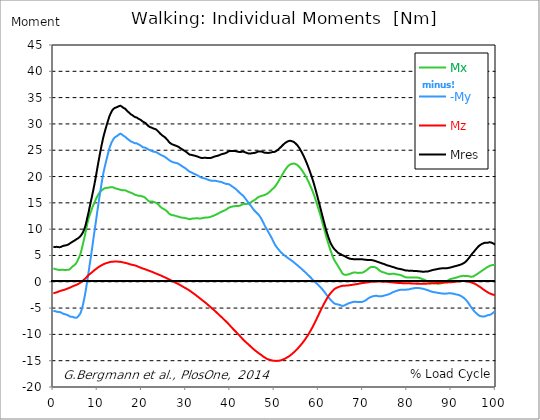
| Category |  Mx |  -My |  Mz |  Mres |
|---|---|---|---|---|
| 0.0 | 2.55 | -5.54 | -2.19 | 6.65 |
| 0.1647276845464841 | 2.49 | -5.52 | -2.15 | 6.59 |
| 0.3294553690929682 | 2.43 | -5.57 | -2.11 | 6.6 |
| 0.5044785339236075 | 2.4 | -5.63 | -2.07 | 6.62 |
| 0.6692062184700917 | 2.37 | -5.68 | -2.03 | 6.64 |
| 0.8339339030165757 | 2.33 | -5.7 | -1.98 | 6.63 |
| 0.9986615875630598 | 2.29 | -5.72 | -1.92 | 6.61 |
| 1.1633892721095438 | 2.24 | -5.75 | -1.88 | 6.6 |
| 1.3384124369401833 | 2.24 | -5.75 | -1.82 | 6.57 |
| 1.5031401214866673 | 2.26 | -5.77 | -1.76 | 6.58 |
| 1.6678678060331513 | 2.26 | -5.81 | -1.71 | 6.6 |
| 1.8325954905796356 | 2.26 | -5.88 | -1.67 | 6.65 |
| 1.9973231751261196 | 2.29 | -5.97 | -1.63 | 6.74 |
| 2.1620508596726036 | 2.27 | -6.05 | -1.61 | 6.8 |
| 2.337074024503243 | 2.26 | -6.11 | -1.57 | 6.85 |
| 2.501801709049727 | 2.25 | -6.14 | -1.52 | 6.87 |
| 2.666529393596211 | 2.25 | -6.17 | -1.47 | 6.89 |
| 2.8312570781426953 | 2.25 | -6.22 | -1.41 | 6.92 |
| 2.9959847626891793 | 2.26 | -6.27 | -1.36 | 6.96 |
| 3.1710079275198186 | 2.29 | -6.31 | -1.3 | 7 |
| 3.3357356120663026 | 2.28 | -6.38 | -1.25 | 7.06 |
| 3.500463296612787 | 2.24 | -6.51 | -1.21 | 7.15 |
| 3.665190981159271 | 2.33 | -6.58 | -1.15 | 7.25 |
| 3.8299186657057547 | 2.49 | -6.61 | -1.08 | 7.35 |
| 4.004941830536394 | 2.64 | -6.64 | -1.02 | 7.44 |
| 4.169669515082878 | 2.81 | -6.65 | -0.95 | 7.53 |
| 4.334397199629363 | 2.92 | -6.67 | -0.88 | 7.61 |
| 4.499124884175846 | 3.01 | -6.7 | -0.82 | 7.67 |
| 4.663852568722331 | 3.1 | -6.77 | -0.76 | 7.77 |
| 4.8285802532688145 | 3.21 | -6.81 | -0.71 | 7.86 |
| 5.003603418099454 | 3.35 | -6.85 | -0.66 | 7.96 |
| 5.168331102645938 | 3.5 | -6.86 | -0.6 | 8.05 |
| 5.333058787192422 | 3.76 | -6.79 | -0.54 | 8.14 |
| 5.497786471738906 | 4.05 | -6.68 | -0.47 | 8.22 |
| 5.662514156285391 | 4.37 | -6.53 | -0.39 | 8.31 |
| 5.83753732111603 | 4.69 | -6.37 | -0.31 | 8.44 |
| 6.0022650056625135 | 5.01 | -6.15 | -0.23 | 8.56 |
| 6.166992690208998 | 5.4 | -5.89 | -0.14 | 8.72 |
| 6.331720374755482 | 5.95 | -5.48 | -0.04 | 8.9 |
| 6.496448059301967 | 6.53 | -5.01 | 0.08 | 9.08 |
| 6.671471224132605 | 7.11 | -4.44 | 0.21 | 9.36 |
| 6.836198908679089 | 7.72 | -3.8 | 0.34 | 9.67 |
| 7.000926593225574 | 8.33 | -3.13 | 0.46 | 10.03 |
| 7.165654277772057 | 8.96 | -2.39 | 0.59 | 10.44 |
| 7.330381962318542 | 9.63 | -1.59 | 0.73 | 10.91 |
| 7.495109646865026 | 10.34 | -0.69 | 0.88 | 11.53 |
| 7.670132811695664 | 11.02 | 0.2 | 1.03 | 12.15 |
| 7.8348604962421495 | 11.59 | 1.09 | 1.17 | 12.72 |
| 7.999588180788634 | 12.1 | 2.03 | 1.31 | 13.36 |
| 8.164315865335118 | 12.56 | 3 | 1.43 | 14.05 |
| 8.329043549881602 | 12.98 | 3.92 | 1.53 | 14.7 |
| 8.504066714712243 | 13.37 | 4.85 | 1.64 | 15.33 |
| 8.668794399258726 | 13.74 | 5.82 | 1.75 | 15.96 |
| 8.833522083805208 | 14.16 | 6.83 | 1.88 | 16.65 |
| 8.998249768351693 | 14.49 | 7.85 | 2 | 17.31 |
| 9.162977452898177 | 14.79 | 8.83 | 2.12 | 18.01 |
| 9.338000617728817 | 15.12 | 9.8 | 2.23 | 18.74 |
| 9.5027283022753 | 15.46 | 10.76 | 2.34 | 19.48 |
| 9.667455986821786 | 15.77 | 11.74 | 2.44 | 20.27 |
| 9.83218367136827 | 16.07 | 12.75 | 2.55 | 21.08 |
| 9.996911355914754 | 16.34 | 13.74 | 2.66 | 21.89 |
| 10.171934520745392 | 16.58 | 14.68 | 2.75 | 22.67 |
| 10.336662205291876 | 16.81 | 15.61 | 2.85 | 23.44 |
| 10.501389889838359 | 17.02 | 16.55 | 2.94 | 24.2 |
| 10.666117574384844 | 17.18 | 17.46 | 3.03 | 24.93 |
| 10.830845258931328 | 17.3 | 18.34 | 3.1 | 25.63 |
| 10.995572943477812 | 17.41 | 19.18 | 3.18 | 26.31 |
| 11.170596108308452 | 17.52 | 20.01 | 3.26 | 26.98 |
| 11.335323792854936 | 17.64 | 20.76 | 3.33 | 27.6 |
| 11.50005147740142 | 17.73 | 21.4 | 3.4 | 28.14 |
| 11.664779161947905 | 17.79 | 22 | 3.45 | 28.64 |
| 11.829506846494388 | 17.83 | 22.59 | 3.5 | 29.14 |
| 12.004530011325027 | 17.85 | 23.17 | 3.55 | 29.61 |
| 12.169257695871512 | 17.86 | 23.75 | 3.59 | 30.09 |
| 12.333985380417996 | 17.88 | 24.3 | 3.63 | 30.54 |
| 12.498713064964479 | 17.9 | 24.85 | 3.68 | 30.99 |
| 12.663440749510965 | 17.93 | 25.37 | 3.72 | 31.43 |
| 12.838463914341604 | 17.95 | 25.78 | 3.75 | 31.77 |
| 13.003191598888087 | 17.98 | 26.11 | 3.78 | 32.05 |
| 13.167919283434573 | 17.98 | 26.5 | 3.8 | 32.37 |
| 13.332646967981058 | 17.99 | 26.75 | 3.81 | 32.58 |
| 13.497374652527538 | 17.96 | 27.02 | 3.82 | 32.78 |
| 13.662102337074025 | 17.88 | 27.21 | 3.83 | 32.91 |
| 13.837125501904662 | 17.8 | 27.4 | 3.84 | 33.02 |
| 14.001853186451148 | 17.76 | 27.49 | 3.84 | 33.07 |
| 14.166580870997631 | 17.72 | 27.59 | 3.85 | 33.13 |
| 14.331308555544114 | 17.67 | 27.71 | 3.85 | 33.2 |
| 14.4960362400906 | 17.65 | 27.76 | 3.84 | 33.24 |
| 14.671059404921238 | 17.59 | 27.82 | 3.82 | 33.25 |
| 14.835787089467724 | 17.56 | 28 | 3.82 | 33.39 |
| 15.000514774014206 | 17.54 | 28.19 | 3.81 | 33.54 |
| 15.165242458560689 | 17.48 | 28.14 | 3.79 | 33.46 |
| 15.329970143107175 | 17.41 | 28.09 | 3.76 | 33.38 |
| 15.504993307937815 | 17.4 | 27.99 | 3.73 | 33.28 |
| 15.669720992484299 | 17.38 | 27.88 | 3.7 | 33.17 |
| 15.834448677030782 | 17.38 | 27.75 | 3.67 | 33.05 |
| 15.999176361577268 | 17.39 | 27.64 | 3.64 | 32.95 |
| 16.16390404612375 | 17.39 | 27.61 | 3.61 | 32.93 |
| 16.33892721095439 | 17.37 | 27.53 | 3.58 | 32.84 |
| 16.503654895500876 | 17.31 | 27.36 | 3.54 | 32.65 |
| 16.668382580047357 | 17.22 | 27.19 | 3.5 | 32.46 |
| 16.833110264593845 | 17.14 | 27.11 | 3.47 | 32.34 |
| 16.997837949140326 | 17.11 | 27.01 | 3.42 | 32.23 |
| 17.16256563368681 | 17.06 | 26.91 | 3.38 | 32.12 |
| 17.33758879851745 | 17 | 26.8 | 3.33 | 31.98 |
| 17.502316483063932 | 16.93 | 26.67 | 3.28 | 31.83 |
| 17.667044167610417 | 16.88 | 26.61 | 3.25 | 31.74 |
| 17.8317718521569 | 16.82 | 26.58 | 3.22 | 31.68 |
| 17.996499536703386 | 16.77 | 26.5 | 3.19 | 31.57 |
| 18.171522701534023 | 16.68 | 26.43 | 3.16 | 31.46 |
| 18.33625038608051 | 16.58 | 26.37 | 3.12 | 31.35 |
| 18.500978070626992 | 16.53 | 26.32 | 3.09 | 31.28 |
| 18.665705755173477 | 16.49 | 26.28 | 3.05 | 31.22 |
| 18.83043343971996 | 16.45 | 26.32 | 3 | 31.23 |
| 19.0054566045506 | 16.4 | 26.24 | 2.94 | 31.13 |
| 19.170184289097087 | 16.36 | 26.14 | 2.88 | 31.02 |
| 19.33491197364357 | 16.33 | 26.05 | 2.82 | 30.92 |
| 19.499639658190056 | 16.35 | 26 | 2.76 | 30.88 |
| 19.66436734273654 | 16.34 | 25.93 | 2.7 | 30.82 |
| 19.82909502728302 | 16.3 | 25.83 | 2.64 | 30.71 |
| 20.004118192113662 | 16.25 | 25.71 | 2.59 | 30.57 |
| 20.168845876660146 | 16.21 | 25.61 | 2.54 | 30.47 |
| 20.33357356120663 | 16.16 | 25.54 | 2.49 | 30.38 |
| 20.49830124575311 | 16.11 | 25.52 | 2.45 | 30.32 |
| 20.663028930299596 | 16.04 | 25.49 | 2.4 | 30.25 |
| 20.838052095130234 | 15.93 | 25.47 | 2.35 | 30.17 |
| 21.002779779676718 | 15.79 | 25.38 | 2.3 | 30.02 |
| 21.167507464223206 | 15.64 | 25.3 | 2.24 | 29.87 |
| 21.332235148769687 | 15.49 | 25.22 | 2.19 | 29.73 |
| 21.496962833316175 | 15.36 | 25.14 | 2.13 | 29.59 |
| 21.671985998146813 | 15.27 | 25.07 | 2.08 | 29.48 |
| 21.836713682693297 | 15.23 | 25.01 | 2.03 | 29.4 |
| 22.00144136723978 | 15.22 | 24.95 | 1.98 | 29.35 |
| 22.166169051786262 | 15.27 | 24.89 | 1.93 | 29.32 |
| 22.33089673633275 | 15.3 | 24.83 | 1.88 | 29.27 |
| 22.505919901163388 | 15.24 | 24.75 | 1.82 | 29.17 |
| 22.670647585709872 | 15.18 | 24.72 | 1.76 | 29.12 |
| 22.835375270256357 | 15.13 | 24.7 | 1.7 | 29.07 |
| 23.00010295480284 | 15.09 | 24.68 | 1.64 | 29.03 |
| 23.164830639349326 | 15.04 | 24.65 | 1.58 | 28.98 |
| 23.32955832389581 | 14.95 | 24.59 | 1.52 | 28.88 |
| 23.50458148872645 | 14.85 | 24.52 | 1.46 | 28.75 |
| 23.66930917327293 | 14.72 | 24.43 | 1.41 | 28.61 |
| 23.834036857819417 | 14.58 | 24.35 | 1.35 | 28.46 |
| 23.998764542365898 | 14.42 | 24.26 | 1.29 | 28.3 |
| 24.163492226912382 | 14.28 | 24.17 | 1.23 | 28.15 |
| 24.338515391743023 | 14.14 | 24.09 | 1.18 | 28.01 |
| 24.503243076289504 | 14.04 | 24.03 | 1.11 | 27.9 |
| 24.667970760835992 | 13.95 | 23.97 | 1.05 | 27.8 |
| 24.832698445382476 | 13.87 | 23.9 | 0.98 | 27.69 |
| 24.997426129928957 | 13.81 | 23.84 | 0.92 | 27.61 |
| 25.1724492947596 | 13.73 | 23.76 | 0.86 | 27.5 |
| 25.337176979306086 | 13.63 | 23.66 | 0.79 | 27.36 |
| 25.501904663852567 | 13.53 | 23.56 | 0.73 | 27.22 |
| 25.66663234839905 | 13.41 | 23.46 | 0.66 | 27.08 |
| 25.831360032945536 | 13.27 | 23.35 | 0.59 | 26.91 |
| 25.99608771749202 | 13.11 | 23.24 | 0.52 | 26.74 |
| 26.171110882322658 | 12.95 | 23.13 | 0.45 | 26.55 |
| 26.335838566869146 | 12.83 | 23.02 | 0.38 | 26.4 |
| 26.50056625141563 | 12.77 | 22.93 | 0.3 | 26.3 |
| 26.665293935962115 | 12.71 | 22.87 | 0.23 | 26.21 |
| 26.830021620508592 | 12.67 | 22.8 | 0.16 | 26.14 |
| 27.00504478533923 | 12.65 | 22.74 | 0.08 | 26.08 |
| 27.169772469885718 | 12.64 | 22.7 | 0.01 | 26.03 |
| 27.334500154432202 | 12.6 | 22.67 | -0.05 | 25.98 |
| 27.499227838978687 | 12.56 | 22.63 | -0.13 | 25.92 |
| 27.66395552352517 | 12.54 | 22.57 | -0.2 | 25.86 |
| 27.83897868835581 | 12.47 | 22.56 | -0.25 | 25.81 |
| 28.003706372902297 | 12.43 | 22.54 | -0.32 | 25.77 |
| 28.168434057448778 | 12.39 | 22.48 | -0.39 | 25.7 |
| 28.333161741995262 | 12.35 | 22.39 | -0.47 | 25.61 |
| 28.497889426541747 | 12.32 | 22.3 | -0.55 | 25.52 |
| 28.662617111088228 | 12.27 | 22.21 | -0.62 | 25.42 |
| 28.837640275918872 | 12.21 | 22.12 | -0.7 | 25.31 |
| 29.002367960465357 | 12.19 | 22.03 | -0.78 | 25.23 |
| 29.167095645011837 | 12.19 | 21.94 | -0.87 | 25.16 |
| 29.331823329558322 | 12.22 | 21.86 | -0.95 | 25.1 |
| 29.496551014104806 | 12.16 | 21.74 | -1.03 | 24.97 |
| 29.671574178935447 | 12.13 | 21.67 | -1.11 | 24.9 |
| 29.836301863481932 | 12.11 | 21.58 | -1.18 | 24.81 |
| 30.001029548028413 | 12.07 | 21.46 | -1.26 | 24.7 |
| 30.165757232574894 | 12.04 | 21.35 | -1.35 | 24.6 |
| 30.330484917121378 | 11.99 | 21.24 | -1.43 | 24.48 |
| 30.505508081952023 | 11.94 | 21.12 | -1.52 | 24.36 |
| 30.670235766498504 | 11.89 | 21.01 | -1.6 | 24.25 |
| 30.834963451044988 | 11.88 | 20.92 | -1.69 | 24.17 |
| 30.999691135591473 | 11.91 | 20.86 | -1.79 | 24.15 |
| 31.16441882013796 | 11.96 | 20.8 | -1.9 | 24.13 |
| 31.339441984968598 | 12 | 20.74 | -2 | 24.11 |
| 31.50416966951508 | 12.02 | 20.65 | -2.1 | 24.05 |
| 31.668897354061563 | 12.03 | 20.57 | -2.2 | 24.01 |
| 31.833625038608048 | 12.04 | 20.52 | -2.3 | 23.98 |
| 31.998352723154536 | 12.05 | 20.46 | -2.4 | 23.95 |
| 32.16308040770102 | 12.05 | 20.4 | -2.51 | 23.91 |
| 32.33810357253166 | 12.06 | 20.33 | -2.62 | 23.87 |
| 32.502831257078135 | 12.06 | 20.26 | -2.73 | 23.83 |
| 32.66755894162463 | 12.05 | 20.18 | -2.84 | 23.77 |
| 32.83228662617111 | 12.04 | 20.1 | -2.95 | 23.71 |
| 32.99701431071759 | 12.03 | 20 | -3.06 | 23.66 |
| 33.17203747554823 | 12.04 | 19.93 | -3.16 | 23.61 |
| 33.336765160094714 | 12.04 | 19.86 | -3.27 | 23.57 |
| 33.5014928446412 | 12.05 | 19.79 | -3.39 | 23.53 |
| 33.66622052918769 | 12.08 | 19.74 | -3.5 | 23.53 |
| 33.83094821373417 | 12.12 | 19.72 | -3.61 | 23.54 |
| 34.00597137856481 | 12.15 | 19.69 | -3.72 | 23.56 |
| 34.17069906311129 | 12.18 | 19.65 | -3.83 | 23.56 |
| 34.33542674765778 | 12.2 | 19.62 | -3.93 | 23.56 |
| 34.50015443220426 | 12.22 | 19.58 | -4.04 | 23.56 |
| 34.664882116750746 | 12.22 | 19.51 | -4.16 | 23.54 |
| 34.829609801297224 | 12.22 | 19.43 | -4.3 | 23.51 |
| 35.004632966127865 | 12.24 | 19.38 | -4.42 | 23.51 |
| 35.169360650674356 | 12.25 | 19.34 | -4.54 | 23.5 |
| 35.334088335220834 | 12.29 | 19.3 | -4.66 | 23.51 |
| 35.49881601976732 | 12.33 | 19.25 | -4.77 | 23.53 |
| 35.6635437043138 | 12.38 | 19.22 | -4.89 | 23.56 |
| 35.838566869144444 | 12.43 | 19.2 | -5.02 | 23.59 |
| 36.00329455369093 | 12.48 | 19.21 | -5.16 | 23.64 |
| 36.16802223823741 | 12.53 | 19.22 | -5.27 | 23.71 |
| 36.3327499227839 | 12.6 | 19.23 | -5.39 | 23.77 |
| 36.497477607330374 | 12.66 | 19.22 | -5.51 | 23.82 |
| 36.67250077216102 | 12.71 | 19.19 | -5.64 | 23.85 |
| 36.83722845670751 | 12.78 | 19.16 | -5.77 | 23.88 |
| 37.001956141253984 | 12.86 | 19.13 | -5.91 | 23.93 |
| 37.166683825800476 | 12.93 | 19.09 | -6.04 | 23.96 |
| 37.33141151034695 | 12.99 | 19.04 | -6.17 | 23.98 |
| 37.496139194893445 | 13.08 | 19.03 | -6.31 | 24.05 |
| 37.671162359724086 | 13.15 | 19.01 | -6.44 | 24.12 |
| 37.83589004427056 | 13.22 | 18.99 | -6.57 | 24.18 |
| 38.00061772881704 | 13.3 | 18.94 | -6.7 | 24.22 |
| 38.16534541336353 | 13.37 | 18.9 | -6.83 | 24.28 |
| 38.33007309791002 | 13.43 | 18.83 | -6.96 | 24.31 |
| 38.50509626274065 | 13.49 | 18.76 | -7.09 | 24.34 |
| 38.66982394728714 | 13.55 | 18.72 | -7.23 | 24.38 |
| 38.83455163183362 | 13.61 | 18.67 | -7.37 | 24.42 |
| 38.99927931638011 | 13.68 | 18.63 | -7.5 | 24.48 |
| 39.16400700092659 | 13.77 | 18.6 | -7.63 | 24.54 |
| 39.33903016575723 | 13.86 | 18.59 | -7.77 | 24.63 |
| 39.503757850303714 | 13.97 | 18.58 | -7.92 | 24.73 |
| 39.6684855348502 | 14.08 | 18.54 | -8.07 | 24.82 |
| 39.83321321939669 | 14.15 | 18.47 | -8.23 | 24.85 |
| 39.99794090394317 | 14.2 | 18.38 | -8.39 | 24.86 |
| 40.1729640687738 | 14.23 | 18.28 | -8.54 | 24.86 |
| 40.33769175332029 | 14.28 | 18.18 | -8.7 | 24.87 |
| 40.50241943786678 | 14.3 | 18.08 | -8.85 | 24.86 |
| 40.66714712241326 | 14.32 | 17.98 | -8.99 | 24.85 |
| 40.831874806959746 | 14.35 | 17.88 | -9.14 | 24.85 |
| 40.99660249150622 | 14.39 | 17.81 | -9.27 | 24.87 |
| 41.17162565633686 | 14.39 | 17.69 | -9.42 | 24.84 |
| 41.336353340883356 | 14.39 | 17.56 | -9.56 | 24.8 |
| 41.50108102542983 | 14.39 | 17.42 | -9.7 | 24.76 |
| 41.66580870997632 | 14.39 | 17.29 | -9.85 | 24.72 |
| 41.8305363945228 | 14.4 | 17.16 | -9.99 | 24.7 |
| 42.005559559353436 | 14.43 | 17.03 | -10.14 | 24.68 |
| 42.17028724389993 | 14.46 | 16.88 | -10.3 | 24.65 |
| 42.33501492844641 | 14.52 | 16.73 | -10.46 | 24.64 |
| 42.4997426129929 | 14.6 | 16.62 | -10.61 | 24.68 |
| 42.664470297539374 | 14.68 | 16.53 | -10.76 | 24.73 |
| 42.839493462370015 | 14.75 | 16.43 | -10.91 | 24.77 |
| 43.00422114691651 | 14.77 | 16.26 | -11.06 | 24.72 |
| 43.168948831462984 | 14.78 | 16.09 | -11.2 | 24.67 |
| 43.33367651600947 | 14.78 | 15.92 | -11.33 | 24.62 |
| 43.49840420055595 | 14.79 | 15.72 | -11.46 | 24.56 |
| 43.66313188510244 | 14.8 | 15.53 | -11.59 | 24.51 |
| 43.83815504993308 | 14.82 | 15.35 | -11.71 | 24.46 |
| 44.00288273447956 | 14.85 | 15.14 | -11.83 | 24.41 |
| 44.16761041902604 | 14.89 | 14.94 | -11.96 | 24.37 |
| 44.332338103572525 | 14.93 | 14.76 | -12.08 | 24.35 |
| 44.49706578811901 | 15 | 14.6 | -12.21 | 24.36 |
| 44.67208895294965 | 15.09 | 14.43 | -12.35 | 24.39 |
| 44.836816637496135 | 15.2 | 14.24 | -12.49 | 24.42 |
| 45.00154432204262 | 15.3 | 14.03 | -12.61 | 24.44 |
| 45.166272006589104 | 15.38 | 13.84 | -12.74 | 24.46 |
| 45.33099969113559 | 15.45 | 13.65 | -12.85 | 24.46 |
| 45.50602285596623 | 15.54 | 13.49 | -12.97 | 24.49 |
| 45.670750540512714 | 15.64 | 13.36 | -13.08 | 24.53 |
| 45.83547822505919 | 15.75 | 13.22 | -13.19 | 24.58 |
| 46.00020590960568 | 15.87 | 13.08 | -13.3 | 24.64 |
| 46.16493359415217 | 15.99 | 12.96 | -13.41 | 24.71 |
| 46.3399567589828 | 16.07 | 12.81 | -13.52 | 24.74 |
| 46.50468444352929 | 16.16 | 12.66 | -13.62 | 24.78 |
| 46.66941212807577 | 16.23 | 12.46 | -13.72 | 24.8 |
| 46.83413981262226 | 16.25 | 12.23 | -13.81 | 24.77 |
| 46.99886749716874 | 16.3 | 12 | -13.91 | 24.73 |
| 47.16359518171523 | 16.35 | 11.76 | -14.02 | 24.72 |
| 47.33861834654586 | 16.39 | 11.48 | -14.13 | 24.68 |
| 47.50334603109235 | 16.42 | 11.18 | -14.24 | 24.61 |
| 47.66807371563883 | 16.47 | 10.89 | -14.33 | 24.56 |
| 47.83280140018532 | 16.51 | 10.61 | -14.42 | 24.51 |
| 47.997529084731795 | 16.58 | 10.36 | -14.5 | 24.5 |
| 48.172552249562436 | 16.67 | 10.14 | -14.58 | 24.52 |
| 48.33727993410892 | 16.76 | 9.87 | -14.67 | 24.5 |
| 48.502007618655405 | 16.81 | 9.62 | -14.71 | 24.48 |
| 48.6667353032019 | 16.93 | 9.36 | -14.76 | 24.5 |
| 48.831462987748374 | 17.06 | 9.12 | -14.8 | 24.52 |
| 49.00648615257901 | 17.19 | 8.88 | -14.85 | 24.55 |
| 49.17121383712551 | 17.3 | 8.62 | -14.88 | 24.56 |
| 49.335941521671984 | 17.46 | 8.38 | -14.93 | 24.6 |
| 49.50066920621847 | 17.61 | 8.09 | -14.97 | 24.65 |
| 49.66539689076495 | 17.73 | 7.8 | -15 | 24.66 |
| 49.83012457531144 | 17.83 | 7.51 | -15.01 | 24.66 |
| 50.00514774014208 | 17.98 | 7.24 | -15.02 | 24.69 |
| 50.16987542468856 | 18.14 | 6.99 | -15.03 | 24.74 |
| 50.33460310923505 | 18.34 | 6.76 | -15.04 | 24.81 |
| 50.499330793781525 | 18.55 | 6.56 | -15.04 | 24.9 |
| 50.66405847832801 | 18.76 | 6.38 | -15.03 | 25.02 |
| 50.83908164315865 | 18.99 | 6.21 | -15.02 | 25.13 |
| 51.003809327705135 | 19.23 | 6.05 | -15.01 | 25.26 |
| 51.16853701225162 | 19.49 | 5.89 | -14.98 | 25.4 |
| 51.3332646967981 | 19.73 | 5.73 | -14.95 | 25.54 |
| 51.49799238134458 | 19.95 | 5.55 | -14.91 | 25.65 |
| 51.67301554617522 | 20.19 | 5.42 | -14.86 | 25.79 |
| 51.837743230721706 | 20.47 | 5.31 | -14.8 | 25.95 |
| 52.00247091526819 | 20.69 | 5.18 | -14.74 | 26.06 |
| 52.16719859981468 | 20.94 | 5.07 | -14.69 | 26.21 |
| 52.33192628436116 | 21.16 | 4.97 | -14.63 | 26.33 |
| 52.5069494491918 | 21.36 | 4.86 | -14.55 | 26.43 |
| 52.67167713373829 | 21.56 | 4.75 | -14.47 | 26.53 |
| 52.83640481828477 | 21.74 | 4.64 | -14.4 | 26.61 |
| 53.00113250283126 | 21.91 | 4.55 | -14.31 | 26.69 |
| 53.16586018737774 | 22.06 | 4.43 | -14.23 | 26.74 |
| 53.33058787192423 | 22.17 | 4.33 | -14.14 | 26.77 |
| 53.50561103675487 | 22.29 | 4.25 | -14.04 | 26.8 |
| 53.67033872130134 | 22.34 | 4.15 | -13.92 | 26.77 |
| 53.83506640584783 | 22.39 | 4.05 | -13.81 | 26.74 |
| 53.99979409039431 | 22.42 | 3.94 | -13.69 | 26.69 |
| 54.164521774940795 | 22.46 | 3.84 | -13.57 | 26.65 |
| 54.339544939771436 | 22.47 | 3.73 | -13.44 | 26.58 |
| 54.50427262431792 | 22.45 | 3.61 | -13.31 | 26.49 |
| 54.669000308864405 | 22.41 | 3.49 | -13.18 | 26.37 |
| 54.83372799341089 | 22.35 | 3.37 | -13.04 | 26.24 |
| 54.998455677957374 | 22.29 | 3.26 | -12.9 | 26.11 |
| 55.173478842788015 | 22.19 | 3.15 | -12.75 | 25.95 |
| 55.3382065273345 | 22.06 | 3.03 | -12.6 | 25.75 |
| 55.502934211880984 | 21.93 | 2.9 | -12.45 | 25.55 |
| 55.66766189642746 | 21.78 | 2.78 | -12.29 | 25.34 |
| 55.83238958097395 | 21.61 | 2.66 | -12.13 | 25.1 |
| 55.997117265520444 | 21.43 | 2.54 | -11.96 | 24.85 |
| 56.17214043035107 | 21.24 | 2.42 | -11.79 | 24.6 |
| 56.336868114897555 | 21.04 | 2.29 | -11.62 | 24.33 |
| 56.50159579944404 | 20.82 | 2.16 | -11.44 | 24.05 |
| 56.666323483990524 | 20.59 | 2.03 | -11.25 | 23.75 |
| 56.83105116853701 | 20.36 | 1.9 | -11.06 | 23.45 |
| 57.00607433336764 | 20.13 | 1.77 | -10.86 | 23.14 |
| 57.170802017914134 | 19.86 | 1.65 | -10.65 | 22.79 |
| 57.33552970246061 | 19.6 | 1.51 | -10.43 | 22.45 |
| 57.5002573870071 | 19.32 | 1.36 | -10.22 | 22.1 |
| 57.66498507155359 | 19.04 | 1.22 | -9.99 | 21.74 |
| 57.84000823638422 | 18.74 | 1.09 | -9.76 | 21.36 |
| 58.00473592093071 | 18.43 | 0.95 | -9.52 | 20.97 |
| 58.16946360547718 | 18.11 | 0.81 | -9.28 | 20.57 |
| 58.334191290023675 | 17.78 | 0.66 | -9.03 | 20.16 |
| 58.49891897457017 | 17.44 | 0.52 | -8.77 | 19.74 |
| 58.663646659116644 | 17.08 | 0.38 | -8.51 | 19.3 |
| 58.838669823947285 | 16.72 | 0.24 | -8.23 | 18.84 |
| 59.00339750849377 | 16.32 | 0.1 | -7.95 | 18.37 |
| 59.168125193040254 | 15.91 | -0.04 | -7.67 | 17.87 |
| 59.33285287758674 | 15.48 | -0.17 | -7.39 | 17.36 |
| 59.49758056213322 | 15.03 | -0.3 | -7.1 | 16.83 |
| 59.672603726963864 | 14.6 | -0.43 | -6.81 | 16.32 |
| 59.83733141151035 | 14.15 | -0.56 | -6.51 | 15.78 |
| 60.002059096056826 | 13.69 | -0.7 | -6.21 | 15.24 |
| 60.16678678060332 | 13.25 | -0.84 | -5.91 | 14.72 |
| 60.33151446514979 | 12.78 | -0.97 | -5.61 | 14.18 |
| 60.506537629980436 | 12.29 | -1.12 | -5.32 | 13.63 |
| 60.67126531452693 | 11.76 | -1.28 | -5.04 | 13.06 |
| 60.8359929990734 | 11.26 | -1.45 | -4.77 | 12.52 |
| 61.00072068361989 | 10.75 | -1.63 | -4.5 | 11.97 |
| 61.165448368166366 | 10.24 | -1.81 | -4.23 | 11.44 |
| 61.34047153299701 | 9.73 | -1.99 | -3.97 | 10.91 |
| 61.5051992175435 | 9.22 | -2.16 | -3.72 | 10.39 |
| 61.669926902089976 | 8.7 | -2.35 | -3.46 | 9.86 |
| 61.83465458663647 | 8.2 | -2.55 | -3.21 | 9.37 |
| 61.999382271182945 | 7.73 | -2.74 | -2.97 | 8.93 |
| 62.16410995572944 | 7.28 | -2.91 | -2.76 | 8.53 |
| 62.33913312056008 | 6.83 | -3.1 | -2.55 | 8.13 |
| 62.50386080510655 | 6.37 | -3.27 | -2.35 | 7.74 |
| 62.66858848965305 | 5.95 | -3.44 | -2.16 | 7.38 |
| 62.83331617419952 | 5.59 | -3.55 | -2.02 | 7.13 |
| 62.998043858746 | 5.2 | -3.69 | -1.86 | 6.87 |
| 63.17306702357666 | 4.8 | -3.85 | -1.71 | 6.63 |
| 63.33779470812313 | 4.44 | -4 | -1.56 | 6.42 |
| 63.50252239266961 | 4.15 | -4.1 | -1.43 | 6.23 |
| 63.667250077216096 | 3.93 | -4.15 | -1.33 | 6.09 |
| 63.83197776176258 | 3.69 | -4.23 | -1.23 | 5.93 |
| 64.00700092659322 | 3.49 | -4.25 | -1.16 | 5.8 |
| 64.1717286111397 | 3.28 | -4.27 | -1.1 | 5.65 |
| 64.33645629568619 | 3.02 | -4.31 | -1.04 | 5.52 |
| 64.50118398023267 | 2.78 | -4.35 | -0.99 | 5.43 |
| 64.66591166477916 | 2.57 | -4.38 | -0.94 | 5.35 |
| 64.83063934932565 | 2.33 | -4.43 | -0.89 | 5.28 |
| 65.00566251415627 | 2.1 | -4.49 | -0.85 | 5.22 |
| 65.17039019870276 | 1.84 | -4.55 | -0.81 | 5.14 |
| 65.33511788324925 | 1.6 | -4.6 | -0.78 | 5.06 |
| 65.49984556779573 | 1.46 | -4.59 | -0.76 | 5.01 |
| 65.66457325234222 | 1.38 | -4.56 | -0.74 | 4.95 |
| 65.83959641717286 | 1.35 | -4.49 | -0.74 | 4.87 |
| 66.00432410171935 | 1.33 | -4.42 | -0.73 | 4.8 |
| 66.16905178626584 | 1.32 | -4.35 | -0.73 | 4.73 |
| 66.3337794708123 | 1.33 | -4.28 | -0.72 | 4.65 |
| 66.4985071553588 | 1.37 | -4.2 | -0.71 | 4.57 |
| 66.67353032018943 | 1.41 | -4.13 | -0.69 | 4.5 |
| 66.83825800473592 | 1.44 | -4.07 | -0.67 | 4.44 |
| 67.0029856892824 | 1.46 | -4.03 | -0.65 | 4.4 |
| 67.16771337382887 | 1.49 | -3.99 | -0.63 | 4.36 |
| 67.33244105837538 | 1.6 | -3.94 | -0.62 | 4.34 |
| 67.49716874292186 | 1.66 | -3.9 | -0.59 | 4.33 |
| 67.67219190775249 | 1.71 | -3.86 | -0.57 | 4.31 |
| 67.83691959229898 | 1.75 | -3.83 | -0.55 | 4.29 |
| 68.00164727684546 | 1.77 | -3.8 | -0.53 | 4.27 |
| 68.16637496139195 | 1.77 | -3.79 | -0.5 | 4.26 |
| 68.33110264593842 | 1.75 | -3.8 | -0.48 | 4.26 |
| 68.50612581076906 | 1.73 | -3.82 | -0.46 | 4.27 |
| 68.67085349531555 | 1.72 | -3.83 | -0.43 | 4.27 |
| 68.83558117986203 | 1.7 | -3.84 | -0.41 | 4.27 |
| 69.00030886440852 | 1.68 | -3.86 | -0.38 | 4.28 |
| 69.165036548955 | 1.68 | -3.86 | -0.35 | 4.28 |
| 69.34005971378564 | 1.71 | -3.85 | -0.32 | 4.28 |
| 69.50478739833213 | 1.7 | -3.85 | -0.3 | 4.29 |
| 69.66951508287862 | 1.7 | -3.85 | -0.27 | 4.29 |
| 69.8342427674251 | 1.72 | -3.82 | -0.25 | 4.27 |
| 69.99897045197157 | 1.77 | -3.78 | -0.23 | 4.25 |
| 70.17399361680222 | 1.84 | -3.72 | -0.21 | 4.23 |
| 70.33872130134871 | 1.91 | -3.65 | -0.19 | 4.21 |
| 70.50344898589518 | 2 | -3.58 | -0.17 | 4.18 |
| 70.66817667044167 | 2.11 | -3.5 | -0.15 | 4.17 |
| 70.83290435498816 | 2.21 | -3.4 | -0.13 | 4.15 |
| 70.99763203953464 | 2.33 | -3.28 | -0.12 | 4.15 |
| 71.17265520436527 | 2.44 | -3.18 | -0.1 | 4.14 |
| 71.33738288891176 | 2.55 | -3.09 | -0.08 | 4.14 |
| 71.50211057345825 | 2.65 | -3.01 | -0.06 | 4.15 |
| 71.66683825800473 | 2.75 | -2.93 | -0.04 | 4.15 |
| 71.83156594255121 | 2.8 | -2.88 | -0.02 | 4.15 |
| 72.00658910738186 | 2.83 | -2.82 | -0.01 | 4.12 |
| 72.17131679192833 | 2.83 | -2.77 | 0.01 | 4.09 |
| 72.33604447647483 | 2.82 | -2.74 | 0.01 | 4.06 |
| 72.5007721610213 | 2.8 | -2.71 | 0.02 | 4.02 |
| 72.6654998455678 | 2.77 | -2.68 | 0.03 | 3.98 |
| 72.84052301039843 | 2.73 | -2.67 | 0.04 | 3.94 |
| 73.0052506949449 | 2.66 | -2.67 | 0.04 | 3.89 |
| 73.1699783794914 | 2.56 | -2.68 | 0.04 | 3.83 |
| 73.33470606403789 | 2.44 | -2.71 | 0.04 | 3.78 |
| 73.49943374858437 | 2.29 | -2.74 | 0.05 | 3.73 |
| 73.66416143313084 | 2.18 | -2.76 | 0.05 | 3.68 |
| 73.83918459796149 | 2.08 | -2.77 | 0.05 | 3.63 |
| 74.00391228250797 | 2 | -2.77 | 0.04 | 3.59 |
| 74.16863996705446 | 1.94 | -2.76 | 0.04 | 3.54 |
| 74.33336765160095 | 1.86 | -2.74 | 0.03 | 3.48 |
| 74.49809533614743 | 1.82 | -2.7 | 0.02 | 3.44 |
| 74.67311850097806 | 1.78 | -2.66 | 0.02 | 3.4 |
| 74.83784618552455 | 1.75 | -2.61 | 0.01 | 3.36 |
| 75.00257387007105 | 1.7 | -2.58 | 0 | 3.29 |
| 75.16730155461751 | 1.63 | -2.54 | -0.01 | 3.23 |
| 75.332029239164 | 1.58 | -2.5 | -0.02 | 3.17 |
| 75.50705240399465 | 1.54 | -2.46 | -0.02 | 3.12 |
| 75.67178008854113 | 1.51 | -2.41 | -0.04 | 3.08 |
| 75.8365077730876 | 1.47 | -2.37 | -0.05 | 3.05 |
| 76.00123545763408 | 1.44 | -2.33 | -0.06 | 3.01 |
| 76.16596314218059 | 1.45 | -2.26 | -0.08 | 2.97 |
| 76.34098630701122 | 1.49 | -2.17 | -0.09 | 2.92 |
| 76.5057139915577 | 1.52 | -2.09 | -0.1 | 2.87 |
| 76.67044167610419 | 1.54 | -2.02 | -0.12 | 2.83 |
| 76.83516936065067 | 1.54 | -1.96 | -0.13 | 2.79 |
| 76.99989704519716 | 1.53 | -1.9 | -0.15 | 2.75 |
| 77.16462472974364 | 1.5 | -1.86 | -0.16 | 2.7 |
| 77.33964789457428 | 1.46 | -1.81 | -0.17 | 2.65 |
| 77.50437557912076 | 1.41 | -1.76 | -0.19 | 2.59 |
| 77.66910326366724 | 1.39 | -1.71 | -0.2 | 2.55 |
| 77.83383094821373 | 1.37 | -1.66 | -0.21 | 2.52 |
| 77.99855863276022 | 1.36 | -1.62 | -0.22 | 2.49 |
| 78.17358179759084 | 1.34 | -1.58 | -0.23 | 2.46 |
| 78.33830948213735 | 1.31 | -1.55 | -0.24 | 2.43 |
| 78.50303716668382 | 1.29 | -1.53 | -0.25 | 2.41 |
| 78.6677648512303 | 1.23 | -1.52 | -0.26 | 2.38 |
| 78.8324925357768 | 1.16 | -1.53 | -0.26 | 2.35 |
| 79.00751570060743 | 1.09 | -1.53 | -0.27 | 2.31 |
| 79.17224338515392 | 1.02 | -1.54 | -0.27 | 2.26 |
| 79.3369710697004 | 0.95 | -1.54 | -0.27 | 2.22 |
| 79.50169875424687 | 0.89 | -1.53 | -0.27 | 2.18 |
| 79.66642643879338 | 0.85 | -1.52 | -0.28 | 2.15 |
| 79.83115412333984 | 0.83 | -1.49 | -0.28 | 2.14 |
| 80.00617728817049 | 0.82 | -1.49 | -0.28 | 2.14 |
| 80.17090497271697 | 0.8 | -1.48 | -0.29 | 2.12 |
| 80.33563265726346 | 0.79 | -1.46 | -0.29 | 2.1 |
| 80.50036034180994 | 0.78 | -1.42 | -0.3 | 2.08 |
| 80.66508802635641 | 0.8 | -1.39 | -0.3 | 2.08 |
| 80.84011119118706 | 0.83 | -1.33 | -0.31 | 2.09 |
| 81.00483887573355 | 0.84 | -1.29 | -0.31 | 2.1 |
| 81.16956656028003 | 0.82 | -1.28 | -0.32 | 2.08 |
| 81.33429424482652 | 0.81 | -1.26 | -0.33 | 2.07 |
| 81.499021929373 | 0.81 | -1.23 | -0.34 | 2.06 |
| 81.67404509420363 | 0.82 | -1.21 | -0.35 | 2.06 |
| 81.83877277875014 | 0.82 | -1.19 | -0.35 | 2.05 |
| 82.00350046329662 | 0.81 | -1.18 | -0.36 | 2.04 |
| 82.1682281478431 | 0.8 | -1.18 | -0.36 | 2.03 |
| 82.33295583238957 | 0.8 | -1.17 | -0.37 | 2.02 |
| 82.50797899722022 | 0.77 | -1.18 | -0.37 | 2.01 |
| 82.67270668176671 | 0.74 | -1.2 | -0.37 | 1.99 |
| 82.83743436631318 | 0.7 | -1.22 | -0.37 | 1.98 |
| 83.00216205085967 | 0.65 | -1.24 | -0.37 | 1.96 |
| 83.16688973540616 | 0.6 | -1.26 | -0.37 | 1.94 |
| 83.33161741995264 | 0.54 | -1.28 | -0.37 | 1.93 |
| 83.50664058478327 | 0.49 | -1.31 | -0.37 | 1.92 |
| 83.67136826932976 | 0.44 | -1.34 | -0.37 | 1.91 |
| 83.83609595387625 | 0.38 | -1.38 | -0.36 | 1.91 |
| 84.00082363842272 | 0.33 | -1.43 | -0.36 | 1.93 |
| 84.16555132296921 | 0.26 | -1.48 | -0.36 | 1.93 |
| 84.34057448779986 | 0.19 | -1.52 | -0.35 | 1.93 |
| 84.50530217234633 | 0.13 | -1.57 | -0.35 | 1.94 |
| 84.67002985689282 | 0.08 | -1.61 | -0.34 | 1.96 |
| 84.83475754143929 | 0.02 | -1.66 | -0.33 | 2 |
| 84.9994852259858 | -0.05 | -1.72 | -0.33 | 2.04 |
| 85.17450839081643 | -0.14 | -1.77 | -0.32 | 2.08 |
| 85.3392360753629 | -0.19 | -1.82 | -0.31 | 2.12 |
| 85.5039637599094 | -0.23 | -1.86 | -0.3 | 2.17 |
| 85.66869144445587 | -0.25 | -1.9 | -0.29 | 2.21 |
| 85.83341912900237 | -0.26 | -1.94 | -0.29 | 2.25 |
| 85.99814681354884 | -0.27 | -1.96 | -0.28 | 2.28 |
| 86.17316997837949 | -0.28 | -1.99 | -0.27 | 2.31 |
| 86.33789766292597 | -0.3 | -2.02 | -0.26 | 2.33 |
| 86.50262534747245 | -0.32 | -2.03 | -0.25 | 2.35 |
| 86.66735303201894 | -0.35 | -2.06 | -0.24 | 2.38 |
| 86.83208071656543 | -0.37 | -2.09 | -0.23 | 2.42 |
| 87.00710388139605 | -0.38 | -2.12 | -0.23 | 2.45 |
| 87.17183156594255 | -0.37 | -2.14 | -0.22 | 2.47 |
| 87.33655925048905 | -0.35 | -2.16 | -0.21 | 2.5 |
| 87.50128693503551 | -0.33 | -2.18 | -0.19 | 2.52 |
| 87.666014619582 | -0.3 | -2.2 | -0.18 | 2.54 |
| 87.84103778441263 | -0.27 | -2.23 | -0.18 | 2.55 |
| 88.00576546895913 | -0.24 | -2.24 | -0.17 | 2.56 |
| 88.1704931535056 | -0.21 | -2.25 | -0.16 | 2.57 |
| 88.33522083805208 | -0.15 | -2.27 | -0.15 | 2.56 |
| 88.49994852259859 | -0.08 | -2.26 | -0.14 | 2.55 |
| 88.66467620714505 | -0.01 | -2.25 | -0.14 | 2.55 |
| 88.8396993719757 | 0.07 | -2.24 | -0.13 | 2.55 |
| 89.00442705652219 | 0.14 | -2.22 | -0.12 | 2.57 |
| 89.16915474106867 | 0.22 | -2.21 | -0.12 | 2.6 |
| 89.33388242561514 | 0.31 | -2.2 | -0.11 | 2.64 |
| 89.49861011016162 | 0.4 | -2.19 | -0.1 | 2.66 |
| 89.67363327499227 | 0.48 | -2.17 | -0.09 | 2.69 |
| 89.83836095953876 | 0.53 | -2.18 | -0.08 | 2.72 |
| 90.00308864408524 | 0.56 | -2.21 | -0.08 | 2.76 |
| 90.16781632863173 | 0.59 | -2.23 | -0.07 | 2.81 |
| 90.33254401317821 | 0.63 | -2.25 | -0.06 | 2.84 |
| 90.50756717800884 | 0.66 | -2.28 | -0.04 | 2.88 |
| 90.67229486255535 | 0.69 | -2.32 | -0.03 | 2.93 |
| 90.83702254710182 | 0.72 | -2.36 | -0.01 | 2.96 |
| 91.0017502316483 | 0.76 | -2.39 | 0.01 | 2.99 |
| 91.16647791619478 | 0.81 | -2.42 | 0.03 | 3.03 |
| 91.34150108102543 | 0.86 | -2.45 | 0.04 | 3.07 |
| 91.50622876557192 | 0.93 | -2.48 | 0.07 | 3.11 |
| 91.67095645011838 | 0.96 | -2.52 | 0.09 | 3.15 |
| 91.83568413466487 | 0.99 | -2.57 | 0.1 | 3.19 |
| 92.00041181921137 | 1.03 | -2.62 | 0.11 | 3.23 |
| 92.16513950375784 | 1.02 | -2.7 | 0.12 | 3.26 |
| 92.34016266858848 | 1.07 | -2.79 | 0.13 | 3.34 |
| 92.50489035313497 | 1.11 | -2.89 | 0.14 | 3.41 |
| 92.66961803768146 | 1.13 | -2.98 | 0.15 | 3.49 |
| 92.83434572222792 | 1.13 | -3.09 | 0.16 | 3.57 |
| 92.99907340677441 | 1.11 | -3.21 | 0.15 | 3.65 |
| 93.17409657160506 | 1.1 | -3.34 | 0.14 | 3.76 |
| 93.33882425615154 | 1.11 | -3.47 | 0.12 | 3.9 |
| 93.50355194069803 | 1.11 | -3.63 | 0.1 | 4.05 |
| 93.66827962524452 | 1.09 | -3.83 | 0.07 | 4.21 |
| 93.833007309791 | 1.07 | -4.03 | 0.03 | 4.39 |
| 94.00803047462163 | 1.04 | -4.24 | -0.01 | 4.56 |
| 94.17275815916813 | 1 | -4.45 | -0.04 | 4.74 |
| 94.3374858437146 | 0.97 | -4.68 | -0.07 | 4.94 |
| 94.5022135282611 | 0.96 | -4.88 | -0.12 | 5.13 |
| 94.66694121280757 | 0.98 | -5.07 | -0.17 | 5.31 |
| 94.83166889735405 | 0.99 | -5.25 | -0.23 | 5.46 |
| 95.0066920621847 | 1.02 | -5.43 | -0.29 | 5.62 |
| 95.17141974673117 | 1.1 | -5.59 | -0.34 | 5.8 |
| 95.33614743127767 | 1.21 | -5.73 | -0.41 | 5.97 |
| 95.50087511582414 | 1.28 | -5.89 | -0.48 | 6.15 |
| 95.66560280037064 | 1.38 | -6 | -0.56 | 6.3 |
| 95.84062596520126 | 1.49 | -6.12 | -0.64 | 6.46 |
| 96.00535364974776 | 1.57 | -6.25 | -0.74 | 6.62 |
| 96.17008133429425 | 1.66 | -6.37 | -0.83 | 6.77 |
| 96.33480901884072 | 1.77 | -6.45 | -0.92 | 6.89 |
| 96.49953670338721 | 1.86 | -6.51 | -1 | 6.99 |
| 96.67455986821784 | 1.95 | -6.55 | -1.1 | 7.08 |
| 96.83928755276433 | 2.06 | -6.58 | -1.2 | 7.16 |
| 97.00401523731081 | 2.15 | -6.59 | -1.31 | 7.23 |
| 97.1687429218573 | 2.24 | -6.61 | -1.42 | 7.3 |
| 97.3334706064038 | 2.34 | -6.6 | -1.52 | 7.35 |
| 97.49819829095026 | 2.44 | -6.58 | -1.62 | 7.39 |
| 97.67322145578092 | 2.53 | -6.56 | -1.72 | 7.42 |
| 97.8379491403274 | 2.63 | -6.49 | -1.8 | 7.41 |
| 98.00267682487387 | 2.72 | -6.42 | -1.88 | 7.4 |
| 98.16740450942035 | 2.81 | -6.36 | -1.97 | 7.41 |
| 98.33213219396683 | 2.88 | -6.34 | -2.07 | 7.44 |
| 98.50715535879748 | 2.95 | -6.33 | -2.15 | 7.49 |
| 98.67188304334397 | 3.02 | -6.31 | -2.21 | 7.51 |
| 98.83661072789045 | 3.07 | -6.24 | -2.27 | 7.49 |
| 99.00133841243694 | 3.11 | -6.16 | -2.34 | 7.46 |
| 99.16606609698341 | 3.15 | -6.07 | -2.38 | 7.41 |
| 99.34108926181405 | 3.19 | -5.96 | -2.42 | 7.34 |
| 99.50581694636055 | 3.21 | -5.85 | -2.46 | 7.26 |
| 99.67054463090703 | 3.21 | -5.74 | -2.5 | 7.18 |
| 99.83527231545351 | 3.21 | -5.63 | -2.54 | 7.1 |
| 100.0 | 3.22 | -5.54 | -2.58 | 7.04 |